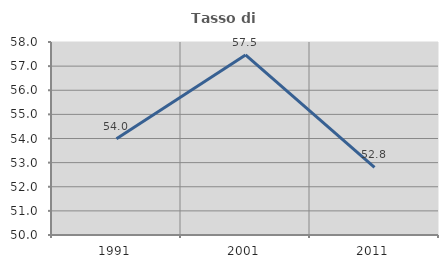
| Category | Tasso di occupazione   |
|---|---|
| 1991.0 | 53.989 |
| 2001.0 | 57.462 |
| 2011.0 | 52.806 |